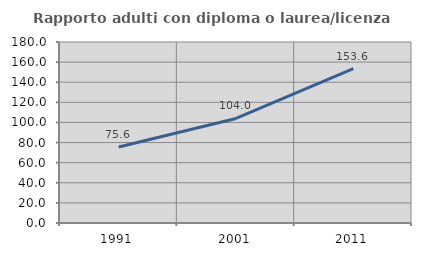
| Category | Rapporto adulti con diploma o laurea/licenza media  |
|---|---|
| 1991.0 | 75.556 |
| 2001.0 | 104 |
| 2011.0 | 153.614 |